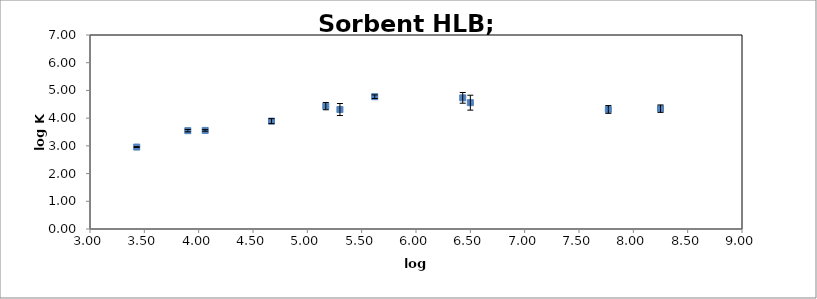
| Category | log Kow |
|---|---|
| 3.43 | 2.956 |
| 4.06 | 3.558 |
| 4.67 | 3.892 |
| 5.3 | 4.311 |
| 6.5 | 4.558 |
| 7.77 | 4.313 |
| 8.25 | 4.342 |
| 3.9 | 3.548 |
| 5.17 | 4.434 |
| 6.43 | 4.732 |
| 5.62 | 4.774 |